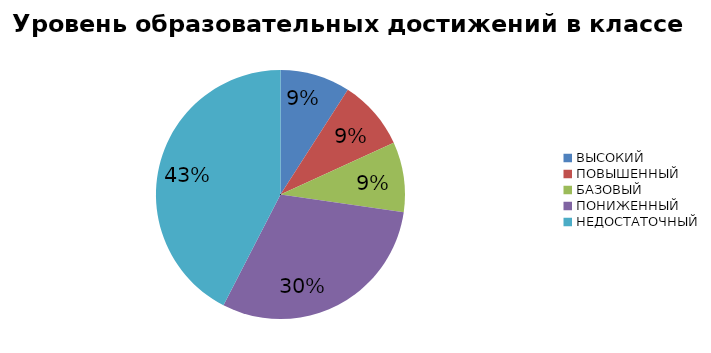
| Category | Series 0 |
|---|---|
| ВЫСОКИЙ | 15.789 |
| ПОВЫШЕННЫЙ | 15.789 |
| БАЗОВЫЙ | 15.789 |
| ПОНИЖЕННЫЙ | 52.632 |
| НЕДОСТАТОЧНЫЙ | 73.684 |